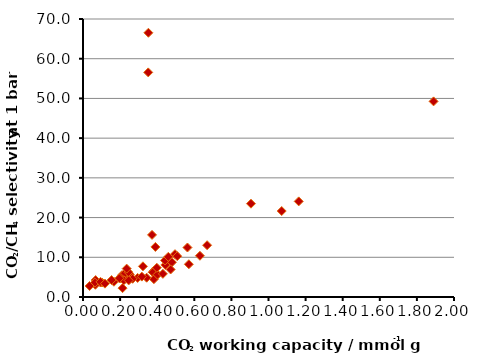
| Category | Series 0 |
|---|---|
| 0.3231061203822455 | 7.724 |
| 0.38133311800860914 | 6.553 |
| 0.22408706553743846 | 5.116 |
| 0.35153879617147044 | 56.555 |
| 0.06806549303568515 | 4.253 |
| 0.09433252251149038 | 3.65 |
| 0.37223319080702905 | 15.637 |
| 0.2521602119817583 | 5.689 |
| 0.20265682760464332 | 4.716 |
| 0.20960635961675342 | 5.476 |
| 0.4440505457535312 | 8.067 |
| 0.39954277082943823 | 5.731 |
| 0.47954572462544015 | 8.747 |
| 0.4420529049635526 | 9.211 |
| 0.3525251009449961 | 66.532 |
| 0.9054469050641423 | 23.498 |
| 0.16683818204613202 | 3.847 |
| 0.22622371685324955 | 6.006 |
| 1.0712519026083216 | 21.647 |
| 0.21335543724122918 | 2.227 |
| 0.4724107262932135 | 6.932 |
| 0.37678017375222356 | 6.232 |
| 0.2447307901098505 | 6.251 |
| 0.3765213478758272 | 6.23 |
| 0.2352678724911963 | 7.141 |
| 0.29455088360355874 | 4.806 |
| 0.2203155988188248 | 4.203 |
| 0.06669749616501951 | 3.079 |
| 1.8899950555949165 | 49.257 |
| 0.5632967174243508 | 12.463 |
| 0.06448442609776657 | 3.613 |
| 0.6304503904712929 | 10.385 |
| 0.3822738157618518 | 4.486 |
| 0.49605386692043685 | 10.783 |
| 0.40166257960462187 | 5.616 |
| 0.15400344765565974 | 4.264 |
| 0.3902734999841462 | 12.606 |
| 0.10250606920513401 | 3.652 |
| 0.5706174089663647 | 8.245 |
| 0.6690437600521317 | 13.035 |
| 0.4598926005012718 | 10.111 |
| 0.3433875321586211 | 4.857 |
| 0.09445134460757462 | 3.814 |
| 0.11833113449664329 | 3.362 |
| 0.26758519642863005 | 4.591 |
| 0.24627539934274145 | 4.177 |
| 0.3979473708835234 | 7.359 |
| 0.19600586901669242 | 4.707 |
| 0.5080559601008958 | 10.275 |
| 1.1629833855552167 | 24.076 |
| 0.317144713521764 | 5.136 |
| 0.035461563758471606 | 2.769 |
| 0.4307138539934366 | 5.831 |